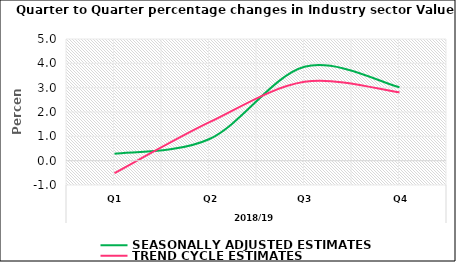
| Category | SEASONALLY ADJUSTED ESTIMATES | TREND CYCLE ESTIMATES |
|---|---|---|
| 0 | 0.28 | -0.514 |
| 1 | 0.89 | 1.58 |
| 2 | 3.856 | 3.241 |
| 3 | 3.014 | 2.807 |